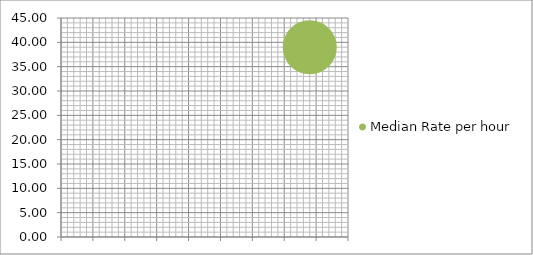
| Category | Median Rate per hour |
|---|---|
| 39.0 | 39 |